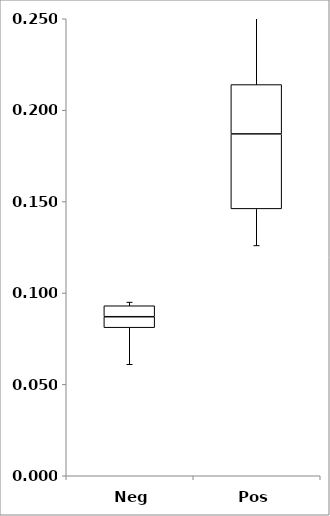
| Category | Series 0 | Series 1 | Series 2 | Series 3 |
|---|---|---|---|---|
| Neg | 0.067 | 0.014 | 0.006 | 0.006 |
| Pos | 0.102 | 0.044 | 0.041 | 0.027 |